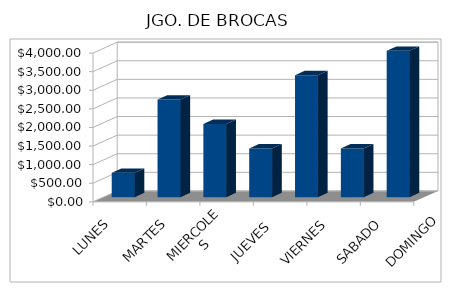
| Category | Series 0 |
|---|---|
| LUNES | 656 |
| MARTES | 2624 |
| MIERCOLES | 1968 |
| JUEVES  | 1312 |
| VIERNES  | 3280 |
| SABADO | 1312 |
| DOMINGO | 3936 |